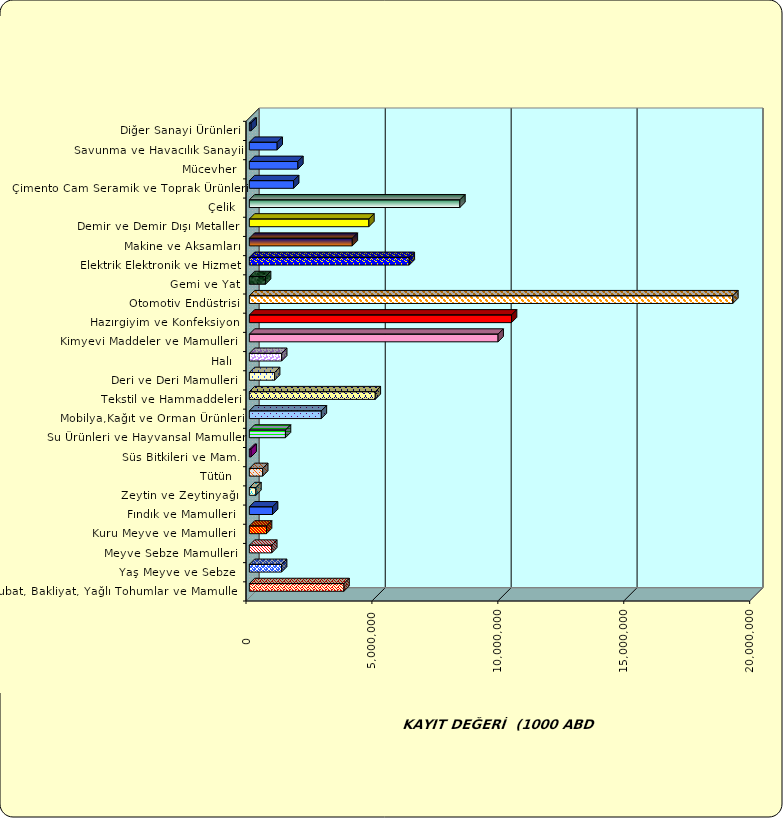
| Category | Series 0 |
|---|---|
|  Hububat, Bakliyat, Yağlı Tohumlar ve Mamulleri  | 3758775.155 |
|  Yaş Meyve ve Sebze   | 1279684.84 |
|  Meyve Sebze Mamulleri  | 889825.436 |
|  Kuru Meyve ve Mamulleri   | 681880.733 |
|  Fındık ve Mamulleri  | 921659.49 |
|  Zeytin ve Zeytinyağı  | 260450.726 |
|  Tütün  | 529982.64 |
|  Süs Bitkileri ve Mam. | 69398.757 |
|  Su Ürünleri ve Hayvansal Mamuller | 1433748.173 |
|  Mobilya,Kağıt ve Orman Ürünleri | 2858297.937 |
|  Tekstil ve Hammaddeleri | 5000926.36 |
|  Deri ve Deri Mamulleri  | 1002540.773 |
|  Halı  | 1282788.28 |
|  Kimyevi Maddeler ve Mamulleri   | 9877205.345 |
|  Hazırgiyim ve Konfeksiyon  | 10410065.602 |
|  Otomotiv Endüstrisi | 19198305.255 |
|  Gemi ve Yat | 642863.158 |
|  Elektrik Elektronik ve Hizmet | 6350020.327 |
|  Makine ve Aksamları | 4087762.871 |
|  Demir ve Demir Dışı Metaller  | 4746574.282 |
|  Çelik | 8359545.881 |
|  Çimento Cam Seramik ve Toprak Ürünleri | 1758573.307 |
|  Mücevher | 1927195.543 |
|  Savunma ve Havacılık Sanayii | 1104728.251 |
|  Diğer Sanayi Ürünleri | 69603.658 |